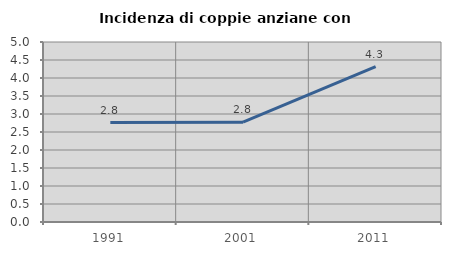
| Category | Incidenza di coppie anziane con figli |
|---|---|
| 1991.0 | 2.763 |
| 2001.0 | 2.772 |
| 2011.0 | 4.316 |